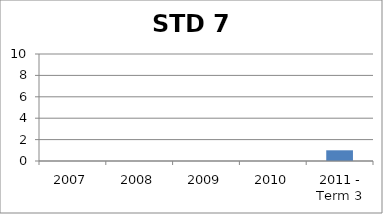
| Category | Rank |
|---|---|
| 2007 | 0 |
| 2008 | 0 |
| 2009 | 0 |
| 2010 | 0 |
| 2011 - Term 3 | 1 |